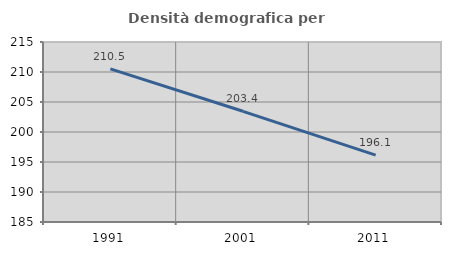
| Category | Densità demografica |
|---|---|
| 1991.0 | 210.519 |
| 2001.0 | 203.45 |
| 2011.0 | 196.147 |